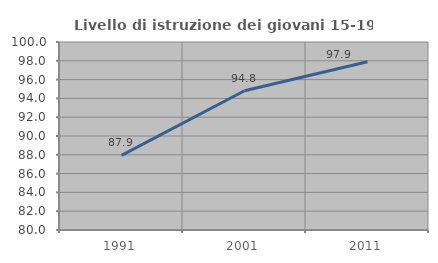
| Category | Livello di istruzione dei giovani 15-19 anni |
|---|---|
| 1991.0 | 87.931 |
| 2001.0 | 94.815 |
| 2011.0 | 97.895 |